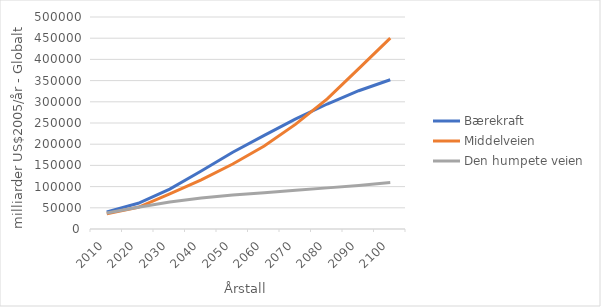
| Category | Bærekraft | Middelveien | Den humpete veien |
|---|---|---|---|
| 2010.0 | 40443.001 | 35957.38 | 37619.939 |
| 2020.0 | 60738.121 | 51111.88 | 51141.041 |
| 2030.0 | 94211.731 | 82756.4 | 63820.124 |
| 2040.0 | 136888.199 | 116027.2 | 73023.938 |
| 2050.0 | 181033.203 | 153329.3 | 79955.967 |
| 2060.0 | 220858.795 | 195635.7 | 85600.532 |
| 2070.0 | 259777.588 | 247252.8 | 91401.288 |
| 2080.0 | 294820.892 | 306723.9 | 96993.267 |
| 2090.0 | 326094.788 | 378385.4 | 102821 |
| 2100.0 | 352095.306 | 450110.5 | 109425 |